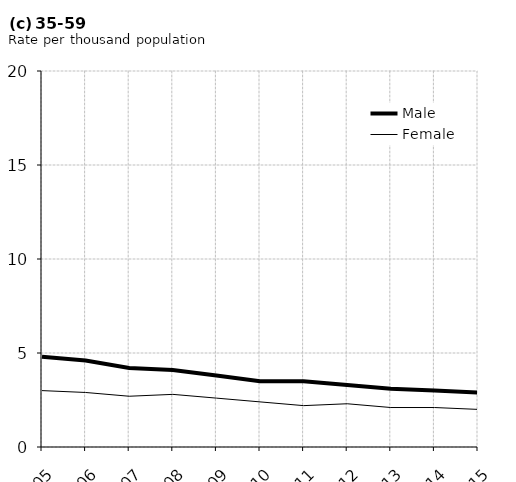
| Category | Male | Female |
|---|---|---|
| 2005.0 | 4.8 | 3 |
| 2006.0 | 4.6 | 2.9 |
| 2007.0 | 4.2 | 2.7 |
| 2008.0 | 4.1 | 2.8 |
| 2009.0 | 3.8 | 2.6 |
| 2010.0 | 3.5 | 2.4 |
| 2011.0 | 3.5 | 2.2 |
| 2012.0 | 3.3 | 2.3 |
| 2013.0 | 3.1 | 2.1 |
| 2014.0 | 3 | 2.1 |
| 2015.0 | 2.9 | 2 |